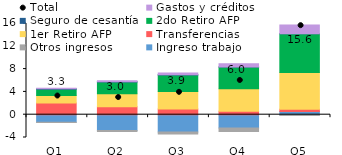
| Category | Ingreso trabajo | Otros ingresos | Transferencias | 1er Retiro AFP | 2do Retiro AFP | Seguro de cesantía | Gastos y créditos |
|---|---|---|---|---|---|---|---|
| Q1 | -1.342 | -0.037 | 2.063 | 1.317 | 1.093 | 0.092 | 0.088 |
| Q2 | -2.763 | -0.174 | 1.412 | 2.284 | 2.035 | 0.059 | 0.163 |
| Q3 | -3.035 | -0.366 | 0.982 | 3.087 | 2.889 | 0.041 | 0.33 |
| Q4 | -2.329 | -0.6 | 0.609 | 3.936 | 3.803 | 0.022 | 0.564 |
| Q5 | 0.556 | -0.131 | 0.39 | 6.462 | 6.781 | 0.007 | 1.554 |